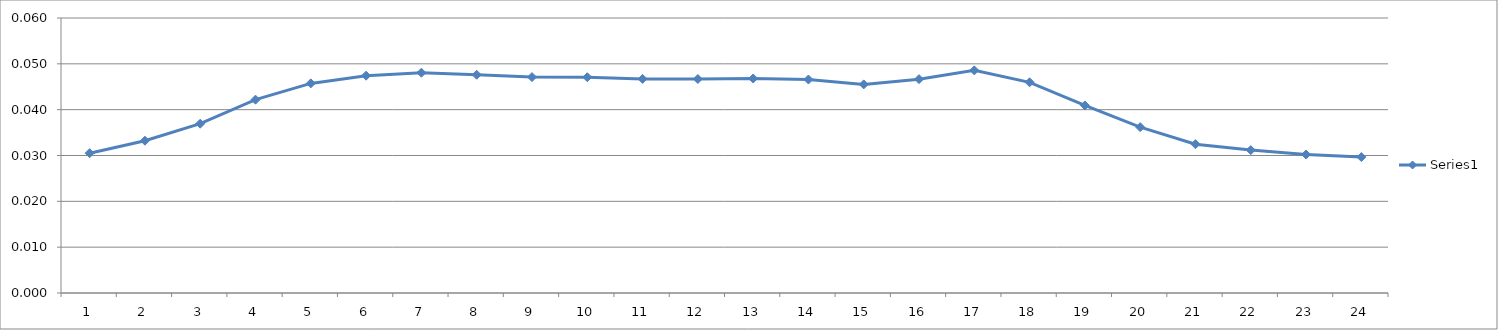
| Category | Series 0 |
|---|---|
| 0 | 0.031 |
| 1 | 0.033 |
| 2 | 0.037 |
| 3 | 0.042 |
| 4 | 0.046 |
| 5 | 0.047 |
| 6 | 0.048 |
| 7 | 0.048 |
| 8 | 0.047 |
| 9 | 0.047 |
| 10 | 0.047 |
| 11 | 0.047 |
| 12 | 0.047 |
| 13 | 0.047 |
| 14 | 0.046 |
| 15 | 0.047 |
| 16 | 0.049 |
| 17 | 0.046 |
| 18 | 0.041 |
| 19 | 0.036 |
| 20 | 0.032 |
| 21 | 0.031 |
| 22 | 0.03 |
| 23 | 0.03 |